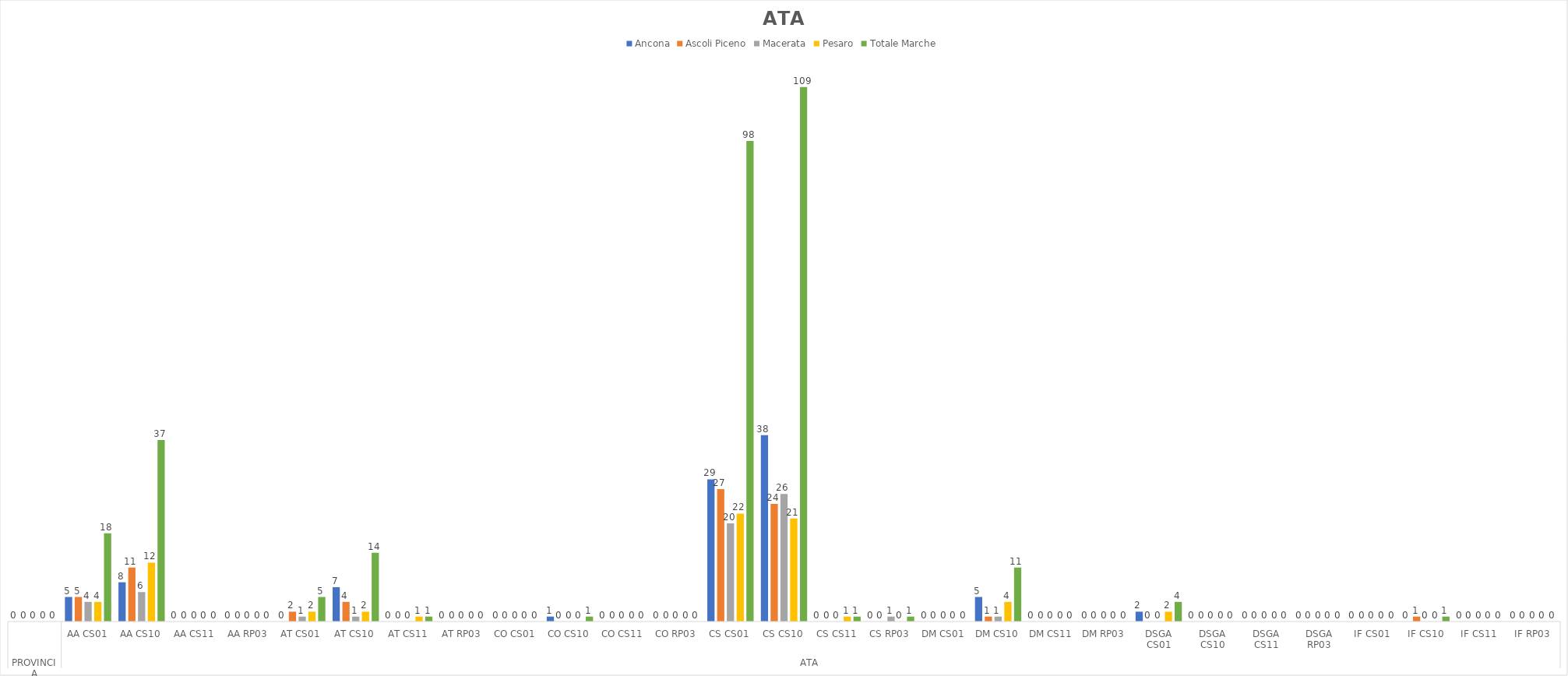
| Category | Ancona | Ascoli Piceno | Macerata | Pesaro | Totale Marche |
|---|---|---|---|---|---|
| 0 | 0 | 0 | 0 | 0 | 0 |
| 1 | 5 | 5 | 4 | 4 | 18 |
| 2 | 8 | 11 | 6 | 12 | 37 |
| 3 | 0 | 0 | 0 | 0 | 0 |
| 4 | 0 | 0 | 0 | 0 | 0 |
| 5 | 0 | 2 | 1 | 2 | 5 |
| 6 | 7 | 4 | 1 | 2 | 14 |
| 7 | 0 | 0 | 0 | 1 | 1 |
| 8 | 0 | 0 | 0 | 0 | 0 |
| 9 | 0 | 0 | 0 | 0 | 0 |
| 10 | 1 | 0 | 0 | 0 | 1 |
| 11 | 0 | 0 | 0 | 0 | 0 |
| 12 | 0 | 0 | 0 | 0 | 0 |
| 13 | 29 | 27 | 20 | 22 | 98 |
| 14 | 38 | 24 | 26 | 21 | 109 |
| 15 | 0 | 0 | 0 | 1 | 1 |
| 16 | 0 | 0 | 1 | 0 | 1 |
| 17 | 0 | 0 | 0 | 0 | 0 |
| 18 | 5 | 1 | 1 | 4 | 11 |
| 19 | 0 | 0 | 0 | 0 | 0 |
| 20 | 0 | 0 | 0 | 0 | 0 |
| 21 | 2 | 0 | 0 | 2 | 4 |
| 22 | 0 | 0 | 0 | 0 | 0 |
| 23 | 0 | 0 | 0 | 0 | 0 |
| 24 | 0 | 0 | 0 | 0 | 0 |
| 25 | 0 | 0 | 0 | 0 | 0 |
| 26 | 0 | 1 | 0 | 0 | 1 |
| 27 | 0 | 0 | 0 | 0 | 0 |
| 28 | 0 | 0 | 0 | 0 | 0 |